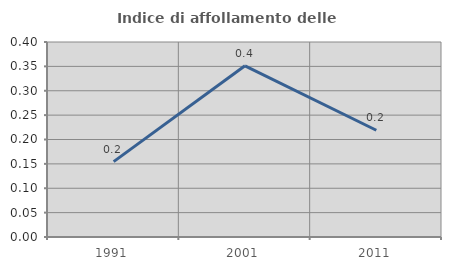
| Category | Indice di affollamento delle abitazioni  |
|---|---|
| 1991.0 | 0.155 |
| 2001.0 | 0.351 |
| 2011.0 | 0.219 |